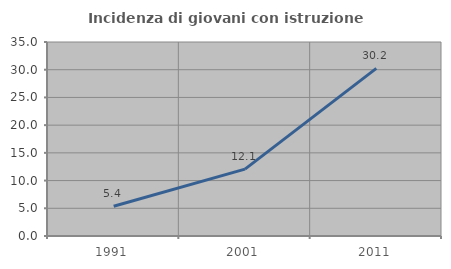
| Category | Incidenza di giovani con istruzione universitaria |
|---|---|
| 1991.0 | 5.357 |
| 2001.0 | 12.069 |
| 2011.0 | 30.233 |